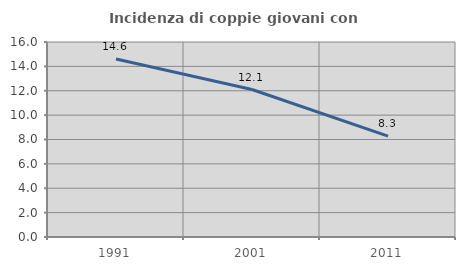
| Category | Incidenza di coppie giovani con figli |
|---|---|
| 1991.0 | 14.602 |
| 2001.0 | 12.101 |
| 2011.0 | 8.273 |